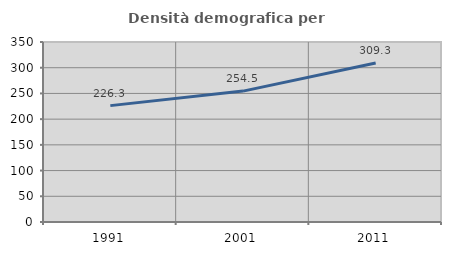
| Category | Densità demografica |
|---|---|
| 1991.0 | 226.281 |
| 2001.0 | 254.536 |
| 2011.0 | 309.309 |